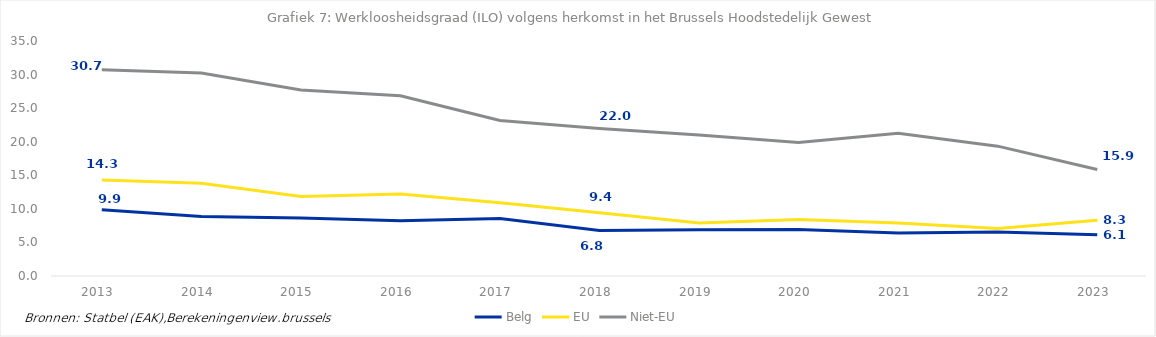
| Category | Belg | EU | Niet-EU |
|---|---|---|---|
| 2013.0 | 9.881 | 14.293 | 30.709 |
| 2014.0 | 8.868 | 13.823 | 30.24 |
| 2015.0 | 8.657 | 11.85 | 27.717 |
| 2016.0 | 8.237 | 12.213 | 26.85 |
| 2017.0 | 8.549 | 10.925 | 23.155 |
| 2018.0 | 6.776 | 9.407 | 21.976 |
| 2019.0 | 6.872 | 7.902 | 20.999 |
| 2020.0 | 6.938 | 8.409 | 19.897 |
| 2021.0 | 6.39 | 7.888 | 21.248 |
| 2022.0 | 6.538 | 7.064 | 19.34 |
| 2023.0 | 6.126 | 8.312 | 15.873 |